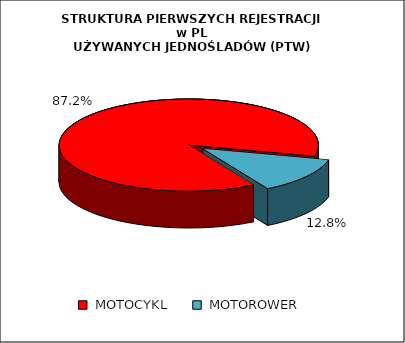
| Category | RAZEM |
|---|---|
|  MOTOCYKL  | 0.872 |
|  MOTOROWER  | 0.128 |